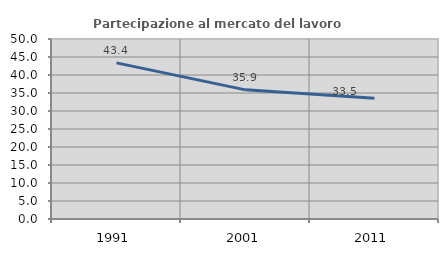
| Category | Partecipazione al mercato del lavoro  femminile |
|---|---|
| 1991.0 | 43.37 |
| 2001.0 | 35.871 |
| 2011.0 | 33.53 |